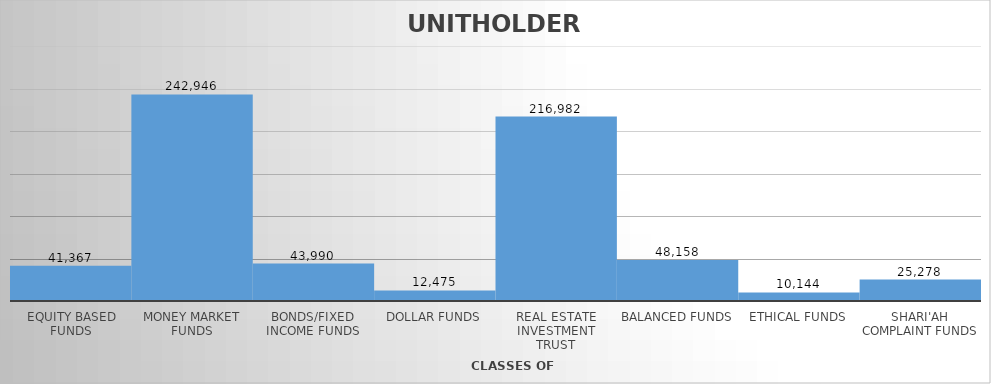
| Category | UNIT HOLDERS |
|---|---|
| EQUITY BASED FUNDS | 41367 |
| MONEY MARKET FUNDS | 242946 |
| BONDS/FIXED INCOME FUNDS | 43990 |
| DOLLAR FUNDS | 12475 |
| REAL ESTATE INVESTMENT TRUST | 216982 |
| BALANCED FUNDS | 48158 |
| ETHICAL FUNDS | 10144 |
| SHARI'AH COMPLAINT FUNDS | 25278 |